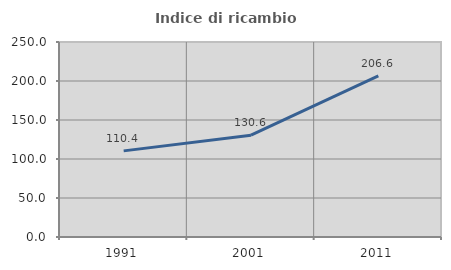
| Category | Indice di ricambio occupazionale  |
|---|---|
| 1991.0 | 110.417 |
| 2001.0 | 130.588 |
| 2011.0 | 206.557 |